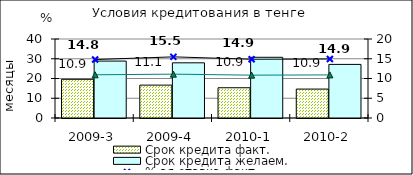
| Category | Срок кредита факт.  | Срок кредита желаем. |
|---|---|---|
| 2009-3 | 19.59 | 28.82 |
| 2009-4 | 16.65 | 27.94 |
| 2010-1 | 15.31 | 30.74 |
| 2010-2 | 14.65 | 27.14 |